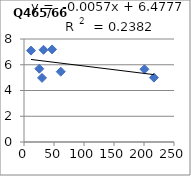
| Category | Q465/665 |
|---|---|
| 25.5 | 5.69 |
| 61.3 | 5.46 |
| 11.7 | 7.1 |
| 216.5 | 5 |
| 46.8 | 7.19 |
| 32.5 | 7.16 |
| 200.8 | 5.65 |
| 30.1 | 4.98 |